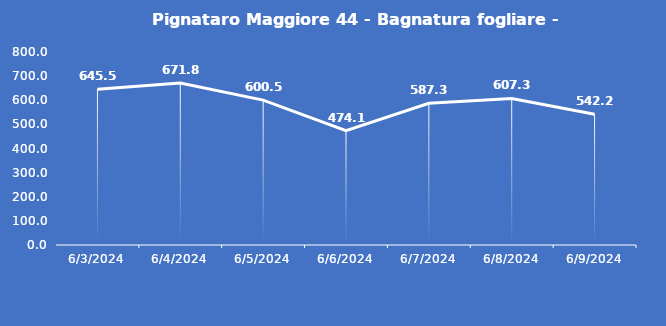
| Category | Pignataro Maggiore 44 - Bagnatura fogliare - Grezzo (min) |
|---|---|
| 6/3/24 | 645.5 |
| 6/4/24 | 671.8 |
| 6/5/24 | 600.5 |
| 6/6/24 | 474.1 |
| 6/7/24 | 587.3 |
| 6/8/24 | 607.3 |
| 6/9/24 | 542.2 |